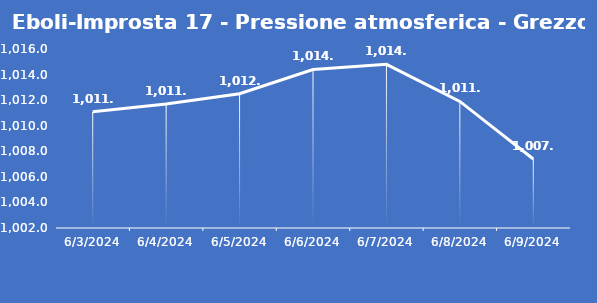
| Category | Eboli-Improsta 17 - Pressione atmosferica - Grezzo (hPa) |
|---|---|
| 6/3/24 | 1011.1 |
| 6/4/24 | 1011.7 |
| 6/5/24 | 1012.5 |
| 6/6/24 | 1014.4 |
| 6/7/24 | 1014.8 |
| 6/8/24 | 1011.9 |
| 6/9/24 | 1007.4 |